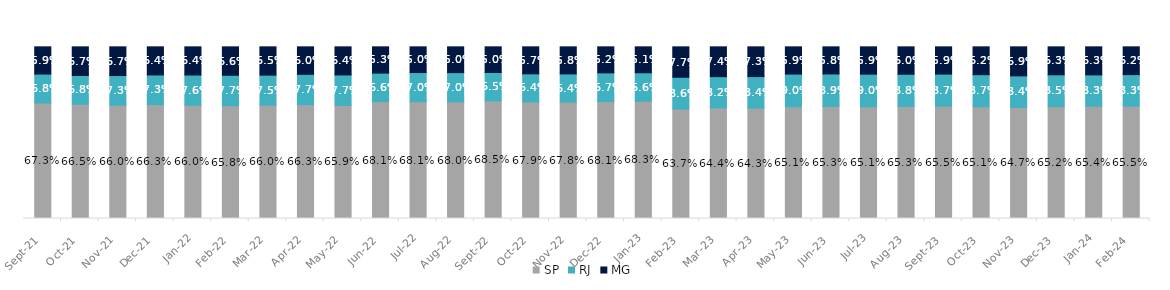
| Category | SP | RJ | MG |
|---|---|---|---|
| 2021-09-01 | 0.673 | 0.168 | 0.159 |
| 2021-10-01 | 0.665 | 0.168 | 0.167 |
| 2021-11-01 | 0.66 | 0.173 | 0.167 |
| 2021-12-01 | 0.663 | 0.173 | 0.164 |
| 2022-01-01 | 0.66 | 0.176 | 0.164 |
| 2022-02-01 | 0.658 | 0.177 | 0.166 |
| 2022-03-01 | 0.66 | 0.175 | 0.165 |
| 2022-04-01 | 0.663 | 0.177 | 0.16 |
| 2022-05-01 | 0.659 | 0.177 | 0.164 |
| 2022-06-01 | 0.681 | 0.166 | 0.153 |
| 2022-07-31 | 0.681 | 0.17 | 0.15 |
| 2022-08-31 | 0.68 | 0.17 | 0.15 |
| 2022-09-01 | 0.685 | 0.165 | 0.15 |
| 2022-10-01 | 0.679 | 0.164 | 0.157 |
| 2022-11-01 | 0.678 | 0.164 | 0.158 |
| 2022-12-01 | 0.681 | 0.167 | 0.152 |
| 2023-01-01 | 0.683 | 0.166 | 0.151 |
| 2023-02-01 | 0.637 | 0.186 | 0.177 |
| 2023-03-01 | 0.644 | 0.182 | 0.174 |
| 2023-04-01 | 0.643 | 0.184 | 0.173 |
| 2023-05-01 | 0.651 | 0.19 | 0.159 |
| 2023-06-01 | 0.653 | 0.189 | 0.158 |
| 2023-07-01 | 0.651 | 0.19 | 0.159 |
| 2023-08-01 | 0.653 | 0.188 | 0.16 |
| 2023-09-01 | 0.655 | 0.187 | 0.159 |
| 2023-10-01 | 0.651 | 0.187 | 0.162 |
| 2023-11-01 | 0.647 | 0.184 | 0.169 |
| 2023-12-01 | 0.652 | 0.185 | 0.163 |
| 2024-01-01 | 0.654 | 0.183 | 0.163 |
| 2024-02-01 | 0.655 | 0.183 | 0.162 |